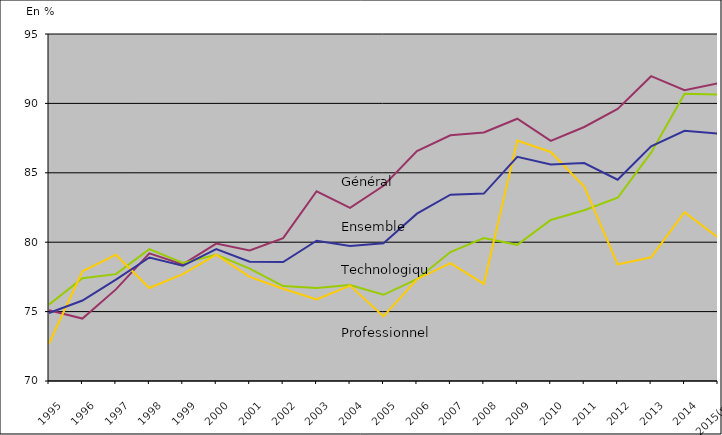
| Category | Baccalauréat général | Baccalauréat technologique | Baccalauréat professionnel | Ensemble |
|---|---|---|---|---|
| 1995 | 75.1 | 75.5 | 72.7 | 74.9 |
| 1996 | 74.5 | 77.4 | 77.9 | 75.8 |
| 1997 | 76.6 | 77.7 | 79.1 | 77.3 |
| 1998 | 79.2 | 79.5 | 76.7 | 78.9 |
| 1999 | 78.4 | 78.5 | 77.7 | 78.3 |
| 2000 | 79.9 | 79.1 | 79.1 | 79.5 |
| 2001 | 79.4 | 78.1 | 77.5 | 78.6 |
| 2002 | 80.297 | 76.838 | 76.645 | 78.57 |
| 2003 | 83.669 | 76.703 | 75.876 | 80.104 |
| 2004 | 82.477 | 76.92 | 76.873 | 79.725 |
| 2005 | 84.065 | 76.211 | 74.657 | 79.921 |
| 2006 | 86.566 | 77.333 | 77.333 | 82.056 |
| 2007 | 87.704 | 79.291 | 78.487 | 83.419 |
| 2008 | 87.9 | 80.3 | 77 | 83.5 |
| 2009 | 88.898 | 79.81 | 87.33 | 86.156 |
| 2010 | 87.3 | 81.6 | 86.5 | 85.6 |
| 2011 | 88.3 | 82.3 | 84 | 85.7 |
| 2012 | 89.6 | 83.2 | 78.4 | 84.5 |
| 2013 | 91.96 | 86.45 | 78.91 | 86.906 |
| 2014 | 90.95 | 90.7 | 82.16 | 88.03 |
| 2015(p) | 91.452 | 90.647 | 80.347 | 87.834 |